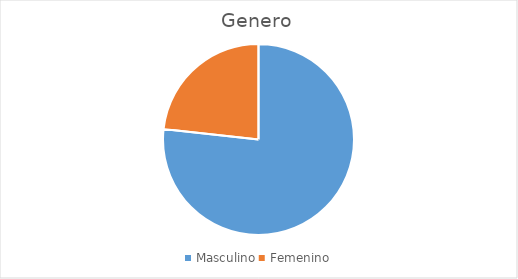
| Category | Series 0 |
|---|---|
| Masculino | 66 |
| Femenino | 20 |